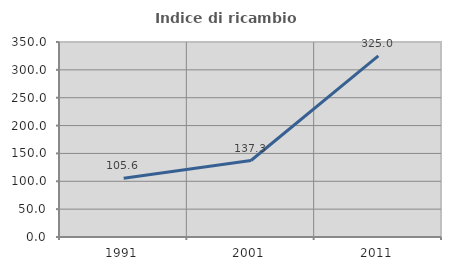
| Category | Indice di ricambio occupazionale  |
|---|---|
| 1991.0 | 105.634 |
| 2001.0 | 137.288 |
| 2011.0 | 325 |